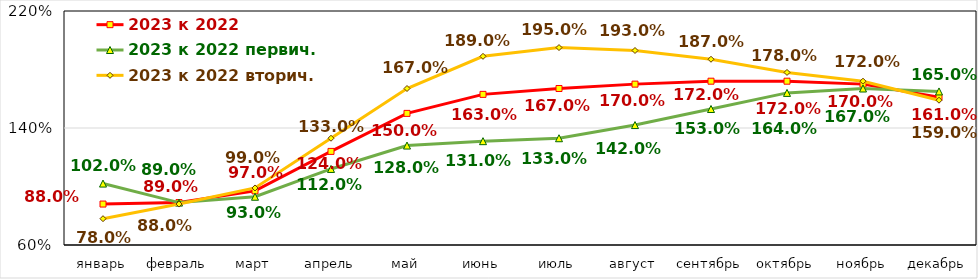
| Category | 2023 к 2022 | 2023 к 2022 первич. | 2023 к 2022 вторич. |
|---|---|---|---|
| январь | 0.88 | 1.02 | 0.78 |
| февраль | 0.89 | 0.89 | 0.88 |
| март | 0.97 | 0.93 | 0.99 |
| апрель | 1.24 | 1.12 | 1.33 |
| май | 1.5 | 1.28 | 1.67 |
| июнь | 1.63 | 1.31 | 1.89 |
| июль | 1.67 | 1.33 | 1.95 |
| август | 1.7 | 1.42 | 1.93 |
| сентябрь | 1.72 | 1.53 | 1.87 |
| октябрь | 1.72 | 1.64 | 1.78 |
| ноябрь | 1.7 | 1.67 | 1.72 |
| декабрь | 1.61 | 1.65 | 1.59 |